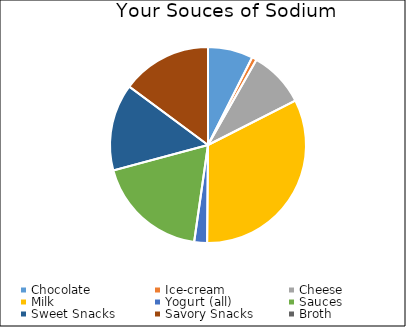
| Category | Series 0 |
|---|---|
| Chocolate | 140 |
| Ice-cream | 15 |
| Cheese | 175 |
| Milk | 615.25 |
| Yogurt (all) | 40 |
| Sauces | 350 |
| Sweet Snacks | 270 |
| Savory Snacks | 280 |
| Broth | 0 |